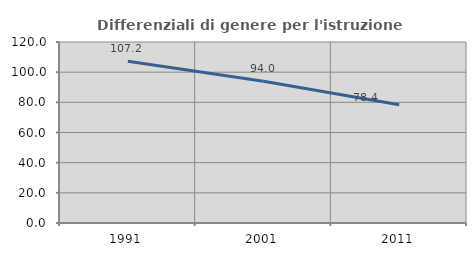
| Category | Differenziali di genere per l'istruzione superiore |
|---|---|
| 1991.0 | 107.191 |
| 2001.0 | 93.98 |
| 2011.0 | 78.378 |